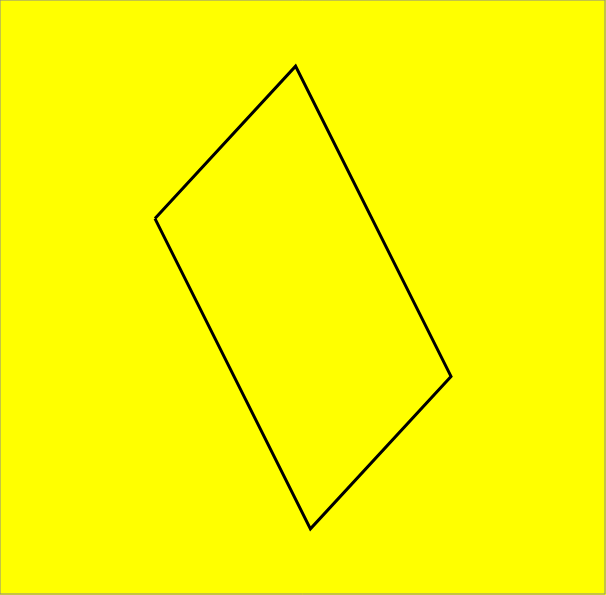
| Category | Series 0 |
|---|---|
| -5.13923773151656 | 2.793 |
| -0.25772622536833945 | 8.188 |
| 5.139237731516561 | -2.793 |
| 0.25772622536834033 | -8.188 |
| -5.13923773151656 | 2.793 |